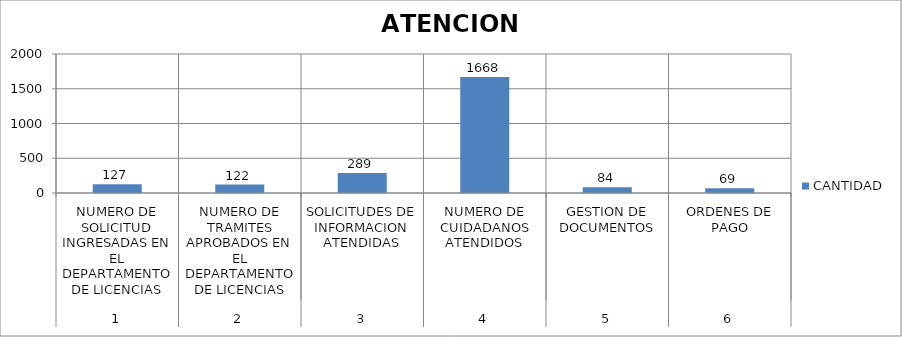
| Category | CANTIDAD |
|---|---|
| 0 | 127 |
| 1 | 122 |
| 2 | 289 |
| 3 | 1668 |
| 4 | 84 |
| 5 | 69 |